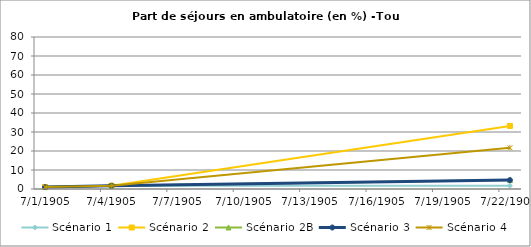
| Category | Scénario 1 | Scénario 2 | Scénario 2B | Scénario 3 | Scénario 4 |
|---|---|---|---|---|---|
| 2009.0 | 1.007 | 1.007 | 1.007 | 1.007 | 1.007 |
| 2012.0 | 1.712 | 1.712 | 1.712 | 1.712 | 1.712 |
| 2030.0 | 1.709 | 33.191 | 4.687 | 4.687 | 21.722 |